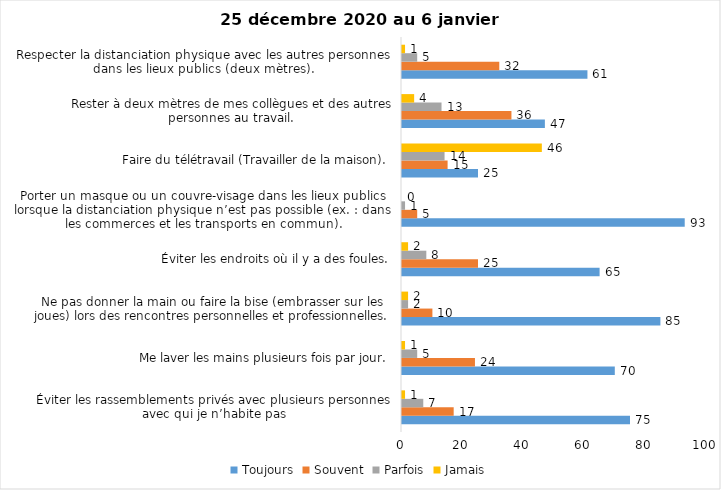
| Category | Toujours | Souvent | Parfois | Jamais |
|---|---|---|---|---|
| Éviter les rassemblements privés avec plusieurs personnes avec qui je n’habite pas | 75 | 17 | 7 | 1 |
| Me laver les mains plusieurs fois par jour. | 70 | 24 | 5 | 1 |
| Ne pas donner la main ou faire la bise (embrasser sur les joues) lors des rencontres personnelles et professionnelles. | 85 | 10 | 2 | 2 |
| Éviter les endroits où il y a des foules. | 65 | 25 | 8 | 2 |
| Porter un masque ou un couvre-visage dans les lieux publics lorsque la distanciation physique n’est pas possible (ex. : dans les commerces et les transports en commun). | 93 | 5 | 1 | 0 |
| Faire du télétravail (Travailler de la maison). | 25 | 15 | 14 | 46 |
| Rester à deux mètres de mes collègues et des autres personnes au travail. | 47 | 36 | 13 | 4 |
| Respecter la distanciation physique avec les autres personnes dans les lieux publics (deux mètres). | 61 | 32 | 5 | 1 |